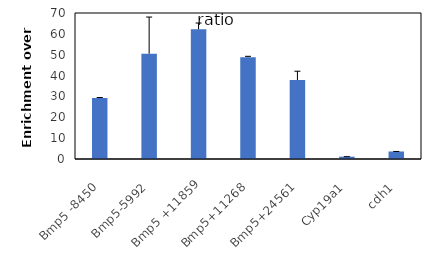
| Category | ratio |
|---|---|
| Bmp5 -8450 | 29.208 |
| Bmp5-5992 | 50.459 |
| Bmp5 +11859 | 62.2 |
| Bmp5+11268 | 48.789 |
| Bmp5+24561 | 37.883 |
| Cyp19a1 | 1.126 |
| cdh1 | 3.604 |